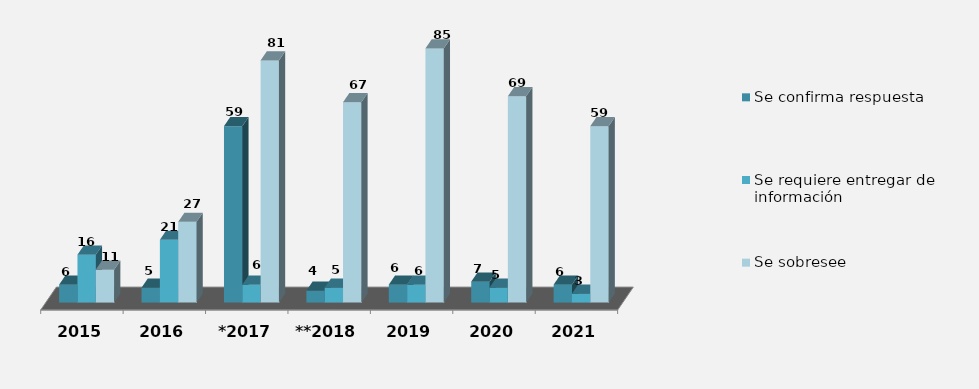
| Category | Se confirma respuesta | Se requiere entregar de información  | Se sobresee  |
|---|---|---|---|
| 2015 | 6 | 16 | 11 |
| 2016 | 5 | 21 | 27 |
| *2017 | 59 | 6 | 81 |
| **2018 | 4 | 5 | 67 |
| 2019 | 6 | 6 | 85 |
| 2020 | 7 | 5 | 69 |
| 2021 | 6 | 3 | 59 |